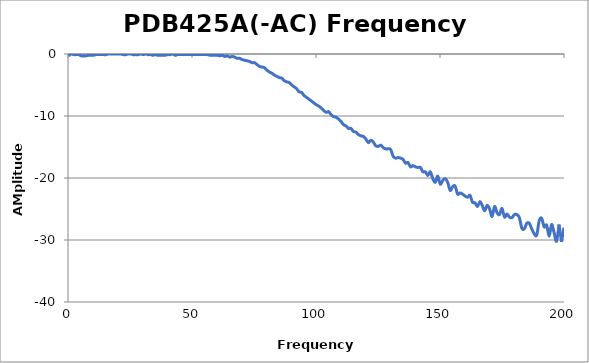
| Category | Series 0 |
|---|---|
| 0.3 | -0.3 |
| 1.3 | 0 |
| 2.3 | -0.1 |
| 3.3 | -0.1 |
| 4.3 | -0.1 |
| 5.3 | -0.3 |
| 6.3 | -0.3 |
| 7.3 | -0.3 |
| 8.3 | -0.2 |
| 9.3 | -0.2 |
| 10.3 | -0.2 |
| 11.3 | -0.1 |
| 12.3 | -0.1 |
| 13.3 | -0.1 |
| 14.3 | -0.1 |
| 15.3 | -0.1 |
| 16.3 | 0 |
| 17.3 | 0 |
| 18.3 | 0 |
| 19.3 | 0 |
| 20.3 | 0 |
| 21.3 | 0 |
| 22.3 | -0.1 |
| 23.3 | -0.1 |
| 24.3 | 0 |
| 25.3 | 0 |
| 26.3 | -0.1 |
| 27.3 | -0.1 |
| 28.3 | -0.1 |
| 29.3 | 0 |
| 30.3 | -0.1 |
| 31.3 | 0 |
| 32.3 | -0.1 |
| 33.3 | -0.1 |
| 34.2 | -0.2 |
| 35.2 | -0.1 |
| 36.2 | -0.2 |
| 37.2 | -0.2 |
| 38.2 | -0.2 |
| 39.2 | -0.2 |
| 40.2 | -0.1 |
| 41.2 | -0.1 |
| 42.2 | 0 |
| 43.2 | -0.2 |
| 44.2 | -0.1 |
| 45.2 | -0.1 |
| 46.2 | -0.1 |
| 47.2 | -0.1 |
| 48.2 | -0.1 |
| 49.2 | -0.1 |
| 50.2 | -0.1 |
| 51.2 | -0.1 |
| 52.2 | -0.1 |
| 53.2 | -0.1 |
| 54.2 | -0.1 |
| 55.2 | -0.1 |
| 56.2 | -0.1 |
| 57.2 | -0.2 |
| 58.2 | -0.2 |
| 59.2 | -0.2 |
| 60.2 | -0.2 |
| 61.2 | -0.3 |
| 62.2 | -0.2 |
| 63.2 | -0.4 |
| 64.2 | -0.3 |
| 65.2 | -0.5 |
| 66.2 | -0.4 |
| 67.2 | -0.5 |
| 68.2 | -0.7 |
| 69.2 | -0.7 |
| 70.2 | -0.9 |
| 71.2 | -1 |
| 72.2 | -1.1 |
| 73.2 | -1.2 |
| 74.2 | -1.4 |
| 75.2 | -1.4 |
| 76.2 | -1.7 |
| 77.2 | -2 |
| 78.2 | -2.1 |
| 79.2 | -2.2 |
| 80.2 | -2.6 |
| 81.2 | -2.9 |
| 82.2 | -3.1 |
| 83.2 | -3.4 |
| 84.2 | -3.6 |
| 85.2 | -3.8 |
| 86.2 | -3.9 |
| 87.2 | -4.3 |
| 88.2 | -4.5 |
| 89.2 | -4.6 |
| 90.2 | -5 |
| 91.2 | -5.3 |
| 92.2 | -5.6 |
| 93.2 | -6.1 |
| 94.2 | -6.2 |
| 95.2 | -6.7 |
| 96.2 | -7 |
| 97.2 | -7.3 |
| 98.2 | -7.6 |
| 99.2 | -7.9 |
| 100.2 | -8.2 |
| 101.1 | -8.4 |
| 102.1 | -8.7 |
| 103.1 | -9.1 |
| 104.1 | -9.4 |
| 105.1 | -9.3 |
| 106.1 | -9.8 |
| 107.1 | -10.1 |
| 108.1 | -10.2 |
| 109.1 | -10.5 |
| 110.1 | -10.9 |
| 111.1 | -11.4 |
| 112.1 | -11.6 |
| 113.1 | -12 |
| 114.1 | -12 |
| 115.1 | -12.5 |
| 116.1 | -12.6 |
| 117.1 | -13 |
| 118.1 | -13.2 |
| 119.1 | -13.3 |
| 120.1 | -13.7 |
| 121.1 | -14.3 |
| 122.1 | -13.9 |
| 123.1 | -14.2 |
| 124.1 | -14.8 |
| 125.1 | -14.9 |
| 126.1 | -14.7 |
| 127.1 | -15.1 |
| 128.1 | -15.3 |
| 129.1 | -15.3 |
| 130.1 | -15.4 |
| 131.1 | -16.5 |
| 132.1 | -16.8 |
| 133.1 | -16.7 |
| 134.1 | -16.8 |
| 135.1 | -17 |
| 136.1 | -17.6 |
| 137.1 | -17.5 |
| 138.1 | -18.2 |
| 139.1 | -18 |
| 140.1 | -18.2 |
| 141.1 | -18.3 |
| 142.1 | -18.3 |
| 143.1 | -19 |
| 144.1 | -19 |
| 145.1 | -19.6 |
| 146.1 | -19 |
| 147.1 | -20.1 |
| 148.1 | -20.7 |
| 149.1 | -19.7 |
| 150.1 | -21 |
| 151.1 | -20.4 |
| 152.1 | -20.1 |
| 153.1 | -20.7 |
| 154.1 | -22 |
| 155.1 | -21.4 |
| 156.1 | -21.3 |
| 157.1 | -22.6 |
| 158.1 | -22.4 |
| 159.1 | -22.6 |
| 160.1 | -22.9 |
| 161.1 | -23.1 |
| 162.1 | -22.8 |
| 163.1 | -23.9 |
| 164.1 | -24 |
| 165.1 | -24.6 |
| 166.1 | -23.8 |
| 167.0 | -24.4 |
| 168.0 | -25.3 |
| 169.0 | -24.4 |
| 170.0 | -25 |
| 171.0 | -26.2 |
| 172.0 | -24.6 |
| 173.0 | -25.6 |
| 174.0 | -25.9 |
| 175.0 | -24.9 |
| 176.0 | -26.3 |
| 177.0 | -25.8 |
| 178.0 | -26.3 |
| 179.0 | -26.4 |
| 180.0 | -25.9 |
| 181.0 | -25.9 |
| 182.0 | -26.4 |
| 183.0 | -28.1 |
| 184.0 | -28.2 |
| 185.0 | -27.3 |
| 186.0 | -27.3 |
| 187.0 | -28.2 |
| 188.0 | -29 |
| 189.0 | -29.2 |
| 190.0 | -26.9 |
| 191.0 | -26.5 |
| 192.0 | -27.9 |
| 193.0 | -27.6 |
| 194.0 | -29.4 |
| 195.0 | -27.5 |
| 196.0 | -28.8 |
| 197.0 | -30.2 |
| 198.0 | -27.5 |
| 199.0 | -30.3 |
| 200.0 | -28 |